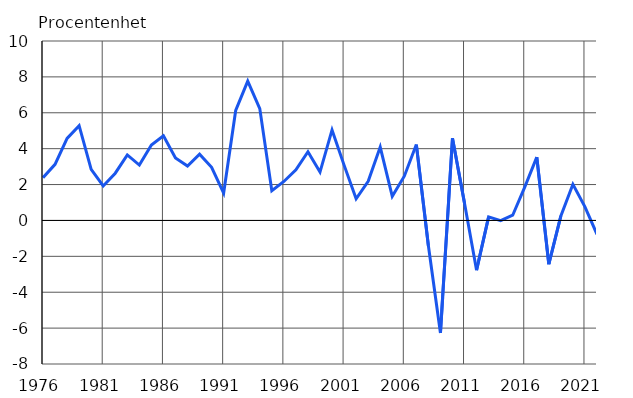
| Category | Procentenhet |
|---|---|
| 1976 | 2.38 |
| 1977 | 3.128 |
| 1978 | 4.569 |
| 1979 | 5.285 |
| 1980 | 2.847 |
| 1981 | 1.921 |
| 1982 | 2.633 |
| 1983 | 3.651 |
| 1984 | 3.088 |
| 1985 | 4.202 |
| 1986 | 4.713 |
| 1987 | 3.483 |
| 1988 | 3.035 |
| 1989 | 3.694 |
| 1990 | 2.962 |
| 1991 | 1.528 |
| 1992 | 6.131 |
| 1993 | 7.767 |
| 1994 | 6.236 |
| 1995 | 1.659 |
| 1996 | 2.172 |
| 1997 | 2.82 |
| 1998 | 3.829 |
| 1999 | 2.695 |
| 2000 | 5.045 |
| 2001 | 3.083 |
| 2002 | 1.204 |
| 2003 | 2.185 |
| 2004 | 4.091 |
| 2005 | 1.342 |
| 2006 | 2.466 |
| 2007 | 4.228 |
| 2008 | -1.409 |
| 2009 | -6.268 |
| 2010 | 4.575 |
| 2011 | 0.962 |
| 2012 | -2.77 |
| 2013 | 0.202 |
| 2014 | -0.014 |
| 2015 | 0.291 |
| 2016 | 1.861 |
| 2017 | 3.527 |
| 2018 | -2.439 |
| 2019 | 0.252 |
| 2020 | 2.012 |
| 2021 | 0.758 |
| 2022* | -0.772 |